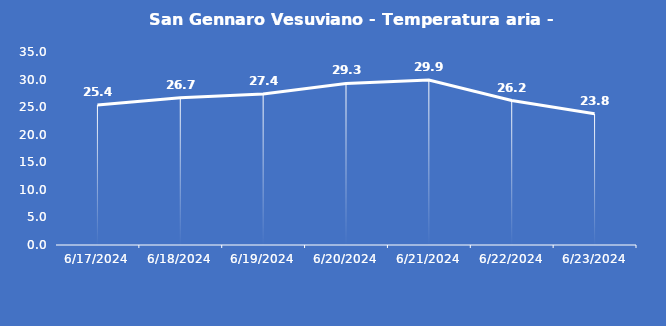
| Category | San Gennaro Vesuviano - Temperatura aria - Grezzo (°C) |
|---|---|
| 6/17/24 | 25.4 |
| 6/18/24 | 26.7 |
| 6/19/24 | 27.4 |
| 6/20/24 | 29.3 |
| 6/21/24 | 29.9 |
| 6/22/24 | 26.2 |
| 6/23/24 | 23.8 |